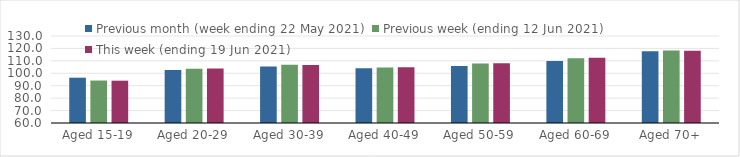
| Category | Previous month (week ending 22 May 2021) | Previous week (ending 12 Jun 2021) | This week (ending 19 Jun 2021) |
|---|---|---|---|
| Aged 15-19 | 96.45 | 94.16 | 94.05 |
| Aged 20-29 | 102.66 | 103.62 | 103.86 |
| Aged 30-39 | 105.48 | 106.84 | 106.66 |
| Aged 40-49 | 103.99 | 104.58 | 104.88 |
| Aged 50-59 | 105.87 | 107.8 | 108.06 |
| Aged 60-69 | 109.8 | 112.16 | 112.59 |
| Aged 70+ | 117.75 | 118.27 | 118.12 |